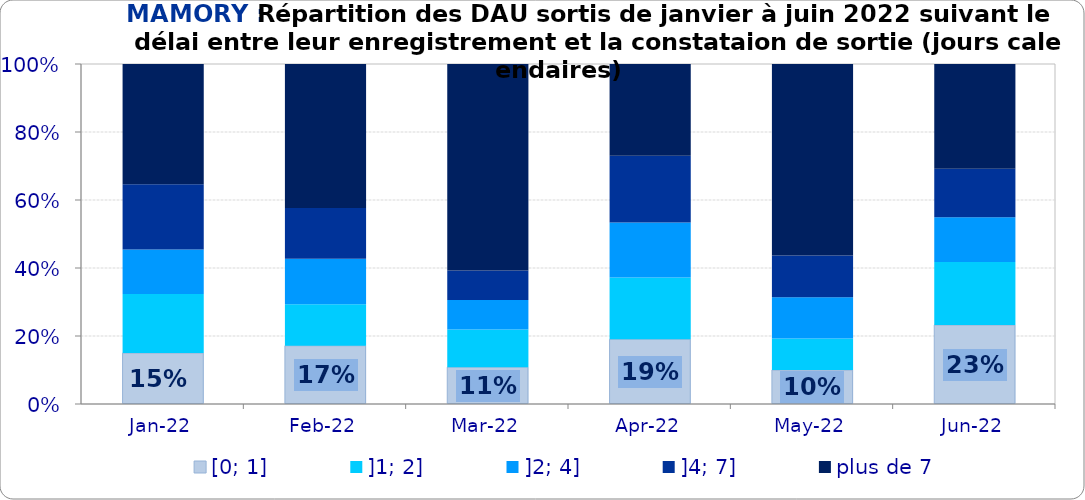
| Category | [0; 1] | ]1; 2] | ]2; 4] | ]4; 7] | plus de 7 |
|---|---|---|---|---|---|
| 2022-01-01 | 0.15 | 0.173 | 0.131 | 0.192 | 0.354 |
| 2022-02-01 | 0.171 | 0.122 | 0.134 | 0.149 | 0.423 |
| 2022-03-01 | 0.108 | 0.111 | 0.087 | 0.086 | 0.608 |
| 2022-04-01 | 0.19 | 0.182 | 0.162 | 0.197 | 0.27 |
| 2022-05-01 | 0.1 | 0.093 | 0.121 | 0.123 | 0.563 |
| 2022-06-01 | 0.232 | 0.186 | 0.131 | 0.143 | 0.308 |